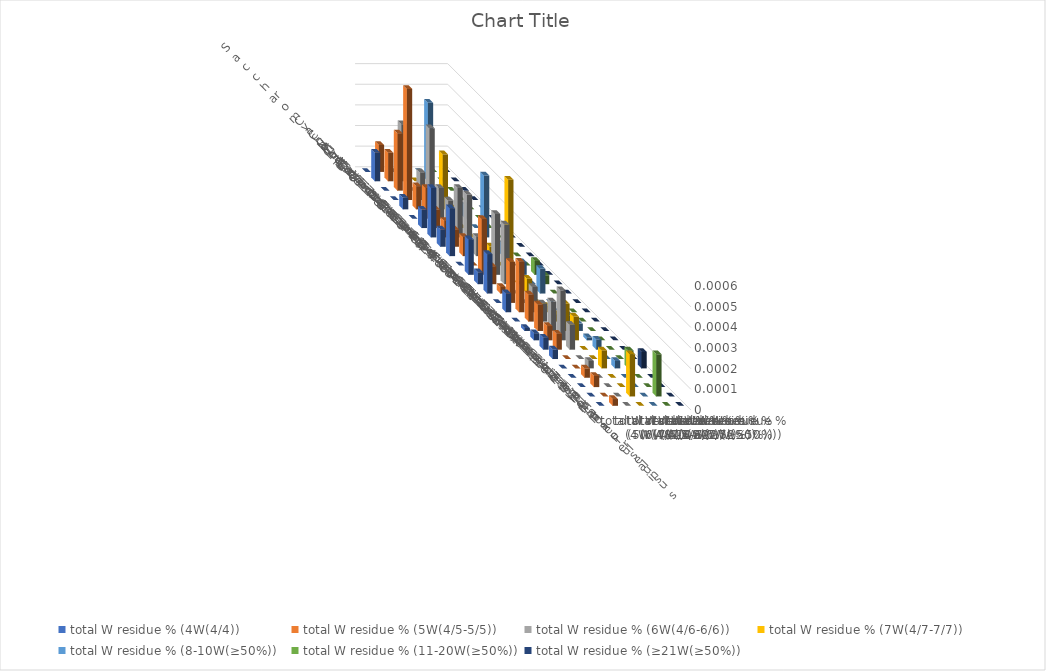
| Category | total W residue % (4W(4/4)) | total W residue % (5W(4/5-5/5)) | total W residue % (6W(4/6-6/6)) | total W residue % (7W(4/7-7/7)) | total W residue % (8-10W(≥50%)) | total W residue % (11-20W(≥50%)) | total W residue % (≥21W(≥50%)) |
|---|---|---|---|---|---|---|---|
| Saccharomyces cerevisiae S288c | 0 | 0 | 0 | 0 | 0 | 0 | 0 |
| Candida albicans | 0 | 0 | 0 | 0 | 0 | 0 | 0 |
| Candida auris | 0 | 0 | 0 | 0 | 0 | 0 | 0 |
| Candida tropicalis | 0 | 0.001 | 0 | 0 | 0 | 0 | 0 |
| Neurospora crassa | 0 | 0 | 0 | 0 | 0 | 0 | 0 |
| Magnaporthe oryzae | 0 | 0 | 0 | 0 | 0 | 0 | 0 |
| Trichoderma reesei | 0 | 0 | 0 | 0 | 0 | 0 | 0 |
| Cryptococcus neoformans | 0 | 0 | 0 | 0 | 0 | 0 | 0 |
| Ustilago maydis | 0 | 0 | 0 | 0 | 0 | 0 | 0 |
| Taiwanofungus camphoratus | 0 | 0 | 0 | 0 | 0 | 0 | 0 |
| Dictyostelium discoideum | 0 | 0 | 0 | 0 | 0 | 0 | 0 |
| Chlamydomonas reinhardtii | 0 | 0 | 0 | 0 | 0 | 0 | 0 |
| Drosophila melanogaster | 0 | 0 | 0 | 0 | 0 | 0 | 0 |
| Aedes aegypti | 0 | 0 | 0 | 0 | 0 | 0 | 0 |
| Plasmodium falciparum | 0 | 0 | 0 | 0 | 0 | 0 | 0 |
| Caenorhabditis elegans | 0 | 0 | 0 | 0 | 0 | 0 | 0 |
| Danio rerio | 0 | 0 | 0 | 0 | 0 | 0 | 0 |
| Mus musculus | 0 | 0 | 0 | 0 | 0 | 0 | 0 |
| Homo sapiens | 0 | 0 | 0 | 0 | 0 | 0 | 0 |
| Arabidopsis thaliana | 0 | 0 | 0 | 0 | 0 | 0 | 0 |
| Tetrahymena thermophila | 0 | 0 | 0 | 0 | 0 | 0 | 0 |
| Paramecium tetraurelia | 0 | 0 | 0 | 0 | 0 | 0 | 0 |
| Oxytricha trifallax | 0 | 0 | 0 | 0 | 0 | 0 | 0 |
| Stylonychia lemnae | 0 | 0 | 0 | 0 | 0 | 0 | 0 |
| Pseudocohnilembus persalinus | 0 | 0 | 0 | 0 | 0 | 0 | 0 |
| Stentor coeruleus | 0 | 0 | 0 | 0 | 0 | 0 | 0 |